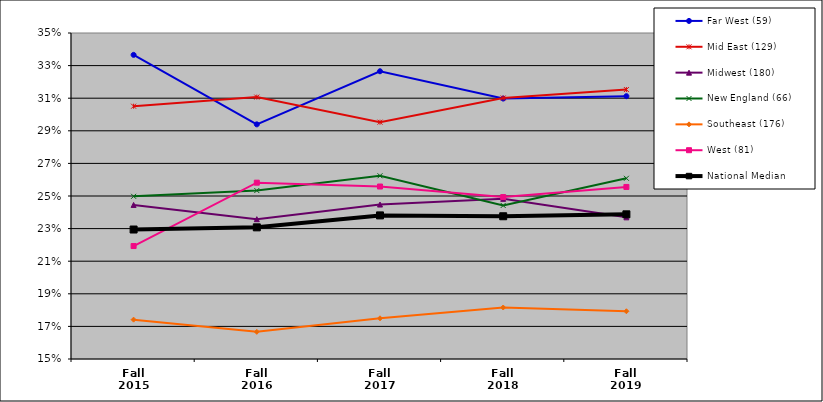
| Category | Far West (59) | Mid East (129) | Midwest (180) | New England (66) | Southeast (176) | West (81) | National Median |
|---|---|---|---|---|---|---|---|
| Fall 2015 | 0.337 | 0.305 | 0.245 | 0.25 | 0.174 | 0.219 | 0.229 |
| Fall 2016 | 0.294 | 0.311 | 0.236 | 0.253 | 0.167 | 0.258 | 0.231 |
| Fall 2017 | 0.327 | 0.295 | 0.245 | 0.262 | 0.175 | 0.256 | 0.238 |
| Fall 2018 | 0.31 | 0.31 | 0.248 | 0.244 | 0.182 | 0.249 | 0.238 |
| Fall 2019 | 0.311 | 0.315 | 0.237 | 0.261 | 0.179 | 0.256 | 0.239 |